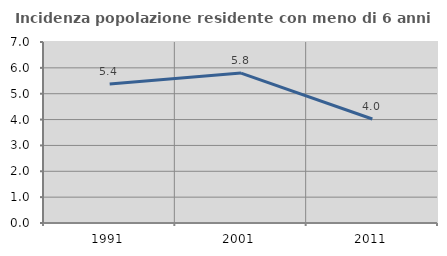
| Category | Incidenza popolazione residente con meno di 6 anni |
|---|---|
| 1991.0 | 5.374 |
| 2001.0 | 5.797 |
| 2011.0 | 4.022 |